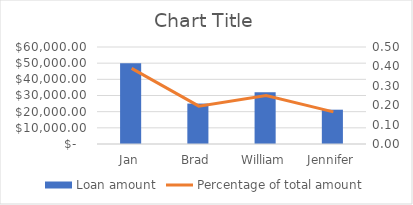
| Category | Loan amount |
|---|---|
| Jan | 50000 |
| Brad | 25000 |
| William | 32000 |
| Jennifer | 21224 |